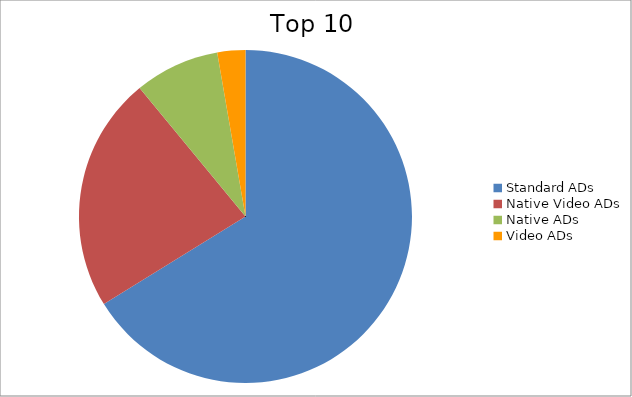
| Category | Series 0 |
|---|---|
| Standard ADs | 66.18 |
| Native Video ADs | 22.85 |
| Native ADs | 8.25 |
| Video ADs | 2.72 |